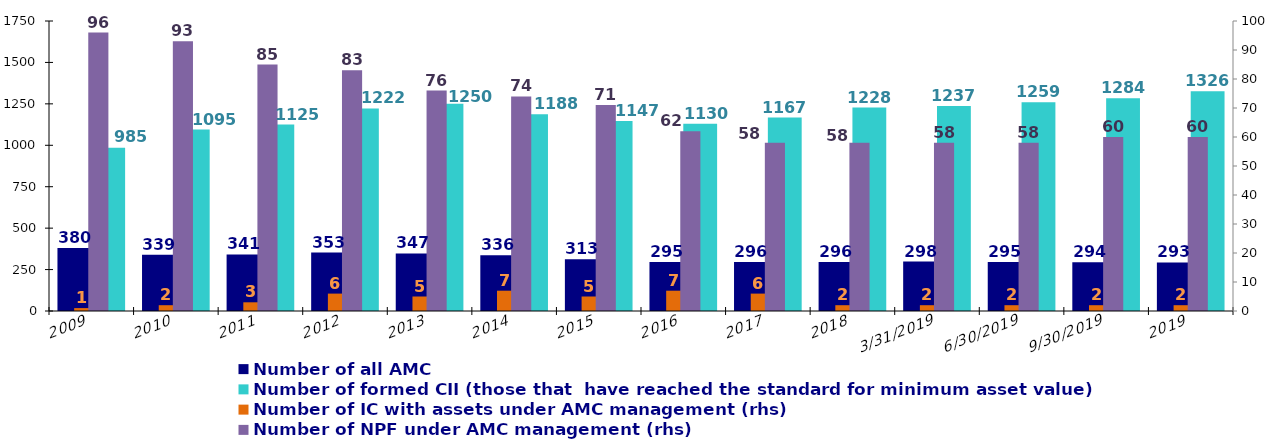
| Category | Number of registered CII per one AMC | Number of all AMC | Number of AMC with CII under management | Number of formed CII (those that  have reached the standard for minimum asset value) |
|---|---|---|---|---|
| 2009 |  | 380 |  | 985 |
| 2010 |  | 339 |  | 1095 |
| 2011 |  | 341 |  | 1125 |
| 2012 |  | 353 |  | 1222 |
| 2013 |  | 347 |  | 1250 |
| 2014 |  | 336 |  | 1188 |
| 2015 |  | 313 |  | 1147 |
| 2016 |  | 295 |  | 1130 |
| 2017 |  | 296 |  | 1167 |
| 2018 |  | 296 |  | 1228 |
| 31.03.2019 |  | 298 |  | 1237 |
| 30.06.2019 |  | 295 |  | 1259 |
| 30.09.2019 |  | 294 |  | 1284 |
| 2019 |  | 293 |  | 1326 |